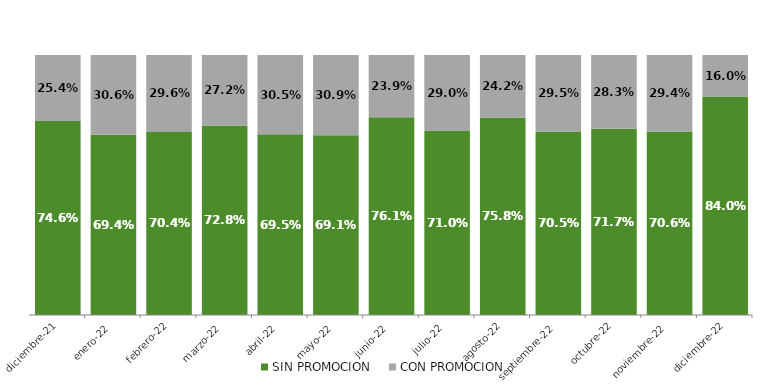
| Category | SIN PROMOCION   | CON PROMOCION   |
|---|---|---|
| 2021-12-01 | 0.746 | 0.254 |
| 2022-01-01 | 0.694 | 0.306 |
| 2022-02-01 | 0.704 | 0.296 |
| 2022-03-01 | 0.728 | 0.272 |
| 2022-04-01 | 0.695 | 0.305 |
| 2022-05-01 | 0.691 | 0.309 |
| 2022-06-01 | 0.761 | 0.239 |
| 2022-07-01 | 0.71 | 0.29 |
| 2022-08-01 | 0.758 | 0.242 |
| 2022-09-01 | 0.705 | 0.295 |
| 2022-10-01 | 0.717 | 0.283 |
| 2022-11-01 | 0.706 | 0.294 |
| 2022-12-01 | 0.84 | 0.16 |